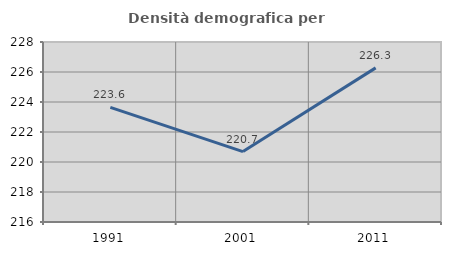
| Category | Densità demografica |
|---|---|
| 1991.0 | 223.637 |
| 2001.0 | 220.694 |
| 2011.0 | 226.275 |